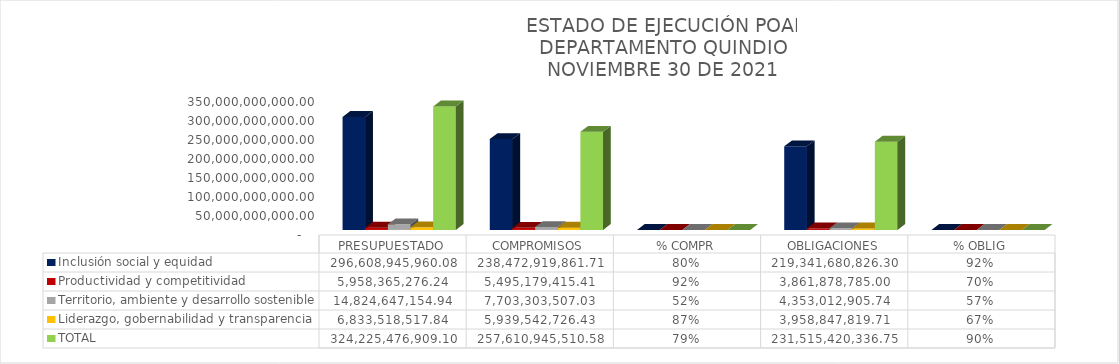
| Category | Inclusión social y equidad | Productividad y competitividad | Territorio, ambiente y desarrollo sostenible | Liderazgo, gobernabilidad y transparencia | TOTAL |
|---|---|---|---|---|---|
|  PRESUPUESTADO  | 296608945960.08 | 5958365276.24 | 14824647154.94 | 6833518517.84 | 324225476909.1 |
|  COMPROMISOS  | 238472919861.71 | 5495179415.41 | 7703303507.03 | 5939542726.43 | 257610945510.58 |
|  % COMPR  | 0.804 | 0.922 | 0.52 | 0.869 | 0.795 |
|  OBLIGACIONES  | 219341680826.3 | 3861878785 | 4353012905.74 | 3958847819.71 | 231515420336.75 |
|  % OBLIG  | 0.92 | 0.703 | 0.565 | 0.667 | 0.899 |